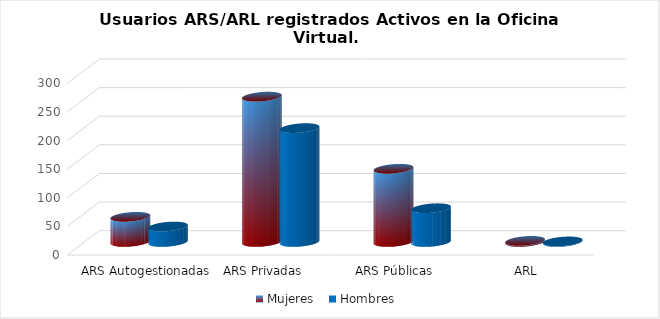
| Category | Mujeres | Hombres |
|---|---|---|
| ARS Autogestionadas | 44 | 27 |
| ARS Privadas | 254 | 199 |
| ARS Públicas | 128 | 59 |
| ARL | 2 | 1 |